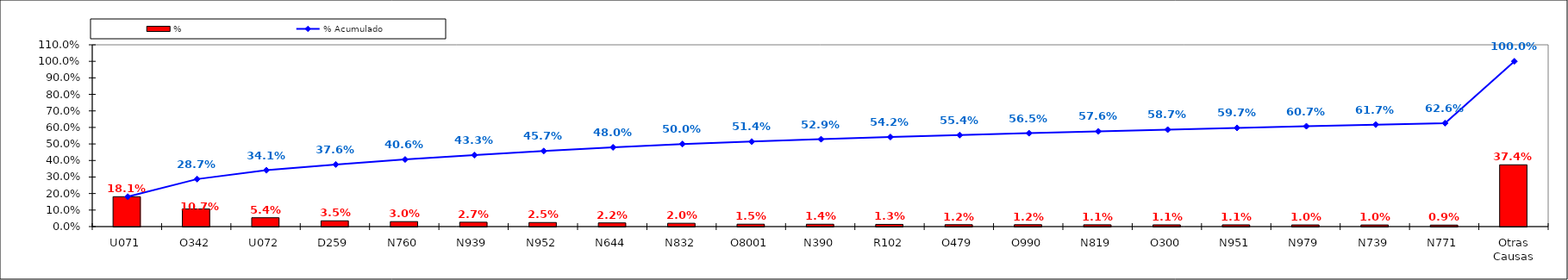
| Category | % |
|---|---|
| U071 | 0.181 |
| O342 | 0.107 |
| U072 | 0.054 |
| D259 | 0.035 |
| N760 | 0.03 |
| N939 | 0.027 |
| N952 | 0.025 |
| N644 | 0.022 |
| N832 | 0.02 |
| O8001 | 0.015 |
| N390 | 0.014 |
| R102 | 0.013 |
| O479 | 0.012 |
| O990 | 0.012 |
| N819 | 0.011 |
| O300 | 0.011 |
| N951 | 0.011 |
| N979 | 0.01 |
| N739 | 0.01 |
| N771 | 0.009 |
| Otras Causas | 0.374 |